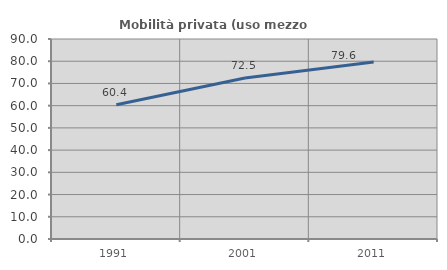
| Category | Mobilità privata (uso mezzo privato) |
|---|---|
| 1991.0 | 60.371 |
| 2001.0 | 72.479 |
| 2011.0 | 79.623 |